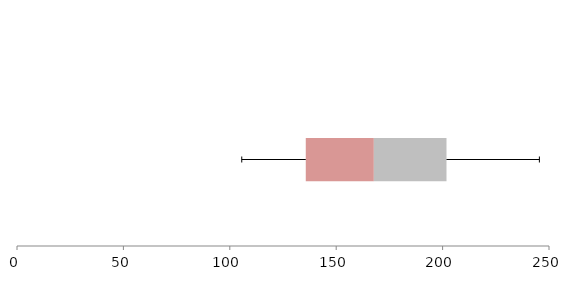
| Category | Series 1 | Series 2 | Series 3 |
|---|---|---|---|
| 0 | 135.703 | 31.987 | 34.143 |